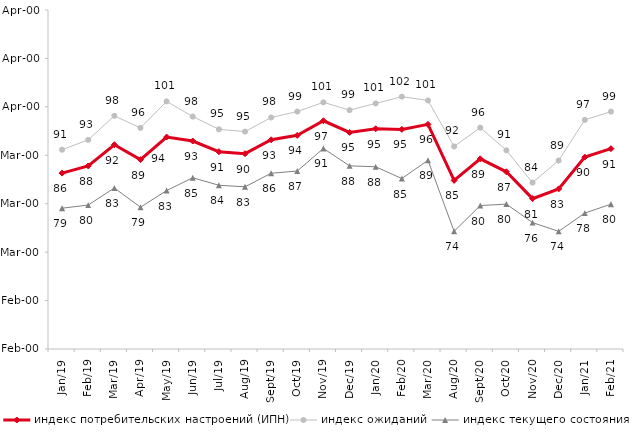
| Category | индекс потребительских настроений (ИПН) | Series 0 | индекс ожиданий | Series 3 | индекс текущего состояния |
|---|---|---|---|---|---|
| 2019-01-01 | 86.32 | 2019-01-01 | 91.15 | 2019-01-01 | 79.075 |
| 2019-02-01 | 87.8 | 2019-02-01 | 93.183 | 2019-02-01 | 79.725 |
| 2019-03-01 | 92.183 | 2019-03-01 | 98.144 | 2019-03-01 | 83.242 |
| 2019-04-01 | 89.109 | 2019-04-01 | 95.66 | 2019-04-01 | 79.282 |
| 2019-05-01 | 93.759 | 2019-05-01 | 101.123 | 2019-05-01 | 82.714 |
| 2019-06-01 | 92.948 | 2019-06-01 | 98.005 | 2019-06-01 | 85.362 |
| 2019-07-01 | 90.743 | 2019-07-01 | 95.363 | 2019-07-01 | 83.812 |
| 2019-08-01 | 90.33 | 2019-08-01 | 94.888 | 2019-08-01 | 83.492 |
| 2019-09-01 | 93.198 | 2019-09-01 | 97.805 | 2019-09-01 | 86.287 |
| 2019-10-01 | 94.119 | 2019-10-01 | 99.026 | 2019-10-01 | 86.757 |
| 2019-11-01 | 97.129 | 2019-11-01 | 100.941 | 2019-11-01 | 91.411 |
| 2019-12-01 | 94.723 | 2019-12-01 | 99.323 | 2019-12-01 | 87.822 |
| 2020-01-01 | 95.475 | 2020-01-01 | 100.71 | 2020-01-01 | 87.624 |
| 2020-02-01 | 95.347 | 2020-02-01 | 102.112 | 2020-02-01 | 85.198 |
| 2020-03-01 | 96.381 | 2020-03-01 | 101.322 | 2020-03-01 | 88.969 |
| 2020-08-01 | 84.816 | 2020-08-01 | 91.824 | 2020-08-01 | 74.305 |
| 2020-09-01 | 89.268 | 2020-09-01 | 95.703 | 2020-09-01 | 79.617 |
| 2020-10-01 | 86.587 | 2020-10-01 | 91.031 | 2020-10-01 | 79.92 |
| 2020-11-01 | 81.05 | 2020-11-01 | 84.35 | 2020-11-01 | 76.1 |
| 2020-12-01 | 83.064 | 2020-12-01 | 88.911 | 2020-12-01 | 74.294 |
| 2021-01-01 | 89.617 | 2021-01-01 | 97.317 | 2021-01-01 | 78.068 |
| 2021-02-01 | 91.365 | 2021-02-01 | 99.007 | 2021-02-01 | 79.901 |